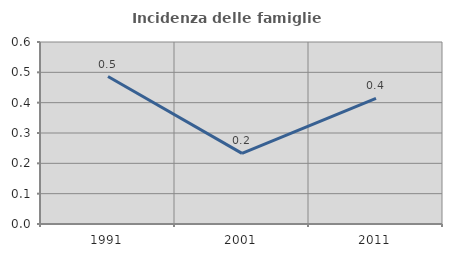
| Category | Incidenza delle famiglie numerose |
|---|---|
| 1991.0 | 0.486 |
| 2001.0 | 0.233 |
| 2011.0 | 0.414 |